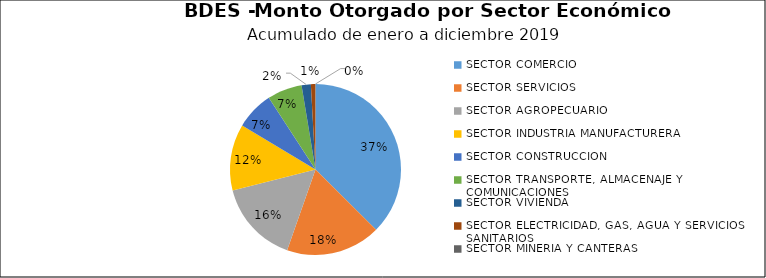
| Category | Monto | Créditos |
|---|---|---|
| SECTOR COMERCIO | 87.108 | 4274 |
| SECTOR SERVICIOS | 41.645 | 493 |
| SECTOR AGROPECUARIO | 36.413 | 1256 |
| SECTOR INDUSTRIA MANUFACTURERA | 29.171 | 437 |
| SECTOR CONSTRUCCION | 16.759 | 590 |
| SECTOR TRANSPORTE, ALMACENAJE Y COMUNICACIONES | 15.296 | 677 |
| SECTOR VIVIENDA | 4.066 | 181 |
| SECTOR ELECTRICIDAD, GAS, AGUA Y SERVICIOS SANITARIOS | 1.955 | 4 |
| SECTOR MINERIA Y CANTERAS | 0.053 | 4 |